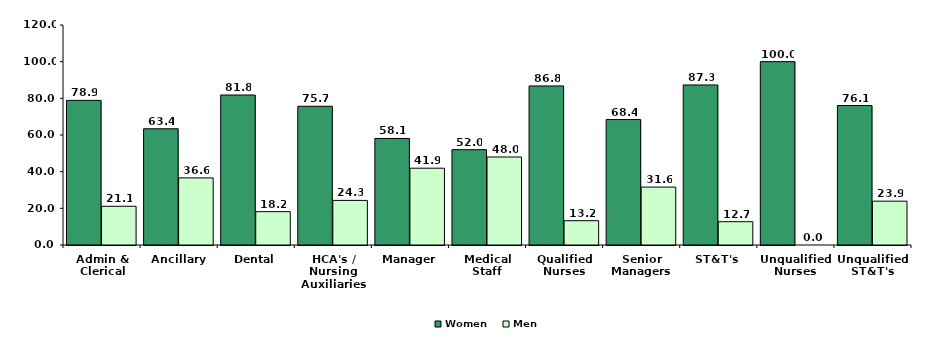
| Category | Women | Men |
|---|---|---|
| Admin & Clerical | 78.882 | 21.118 |
| Ancillary | 63.399 | 36.601 |
| Dental | 81.818 | 18.182 |
| HCA's / Nursing Auxiliaries | 75.676 | 24.324 |
| Manager | 58.108 | 41.892 |
| Medical Staff | 52 | 48 |
| Qualified Nurses | 86.754 | 13.246 |
| Senior Managers | 68.421 | 31.579 |
| ST&T's | 87.298 | 12.702 |
| Unqualified Nurses | 100 | 0 |
| Unqualified ST&T's | 76.087 | 23.913 |